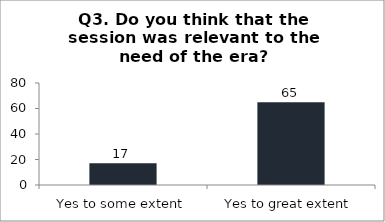
| Category | Q3. Do you think that the session was relevant to the need of the era? |
|---|---|
| Yes to some extent | 17 |
| Yes to great extent | 65 |